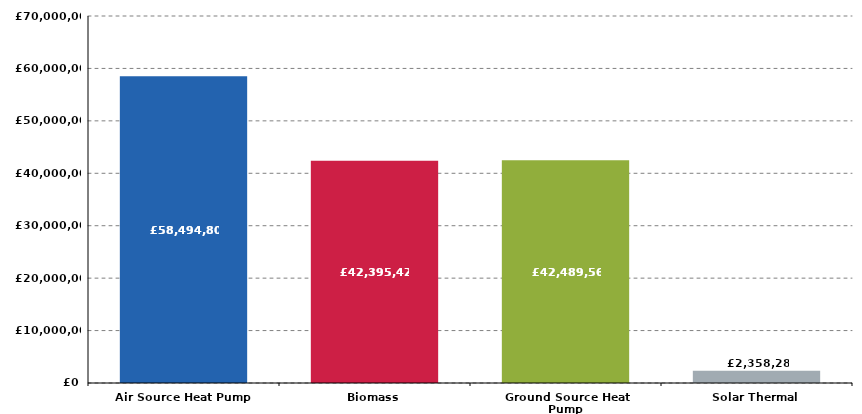
| Category | Series 0 |
|---|---|
| Air Source Heat Pump | 58494802.87 |
| Biomass | 42395421.36 |
| Ground Source Heat Pump | 42489568.06 |
| Solar Thermal | 2358281.05 |